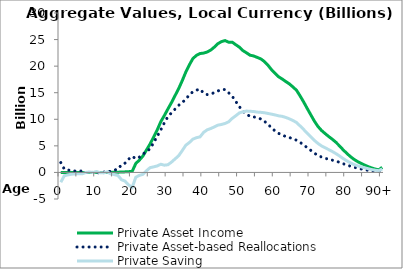
| Category | Private Asset Income | Private Asset-based Reallocations | Private Saving |
|---|---|---|---|
| 0 | 0 | 1848.723 | -1848.723 |
|  | 0 | 621.304 | -621.304 |
| 2 | 0 | 463.708 | -463.708 |
| 3 | 0 | 339.941 | -339.941 |
| 4 | 0 | 268.465 | -268.465 |
| 5 | 0 | 250.375 | -250.375 |
| 6 | 0.54 | 271.318 | -270.779 |
| 7 | 1.483 | 6.228 | -4.745 |
| 8 | 2.425 | -84.555 | 86.979 |
| 9 | 3.034 | 21.461 | -18.427 |
| 10 | 3.528 | -180.716 | 184.243 |
| 11 | 4.622 | 66.007 | -61.385 |
| 12 | 6.54 | 94.788 | -88.248 |
| 13 | 8.104 | -99.716 | 107.82 |
| 14 | 17.274 | 296.688 | -279.414 |
| 15 | 30.619 | 434.436 | -403.817 |
| 16 | 47.949 | 622.904 | -574.954 |
| 17 | 70.703 | 1446.324 | -1375.622 |
| 18 | 106.69 | 1750.698 | -1644.008 |
| 19 | 146.236 | 2509.724 | -2363.488 |
| 20 | 202.165 | 3020.792 | -2818.627 |
| 21 | 1678.616 | 2594.838 | -916.221 |
| 22 | 2319.44 | 2875.159 | -555.719 |
| 23 | 3084.248 | 3448.272 | -364.024 |
| 24 | 4225.514 | 3903.711 | 321.803 |
| 25 | 5349.457 | 4455.127 | 894.33 |
| 26 | 6650.23 | 5601.768 | 1048.463 |
| 27 | 8001.306 | 6782.23 | 1219.076 |
| 28 | 9540.818 | 8003.009 | 1537.809 |
| 29 | 10709.591 | 9346.703 | 1362.888 |
| 30 | 11948.887 | 10504.693 | 1444.194 |
| 31 | 13151.682 | 11209.677 | 1942.005 |
| 32 | 14460.383 | 11919.344 | 2541.039 |
| 33 | 15764.883 | 12625.617 | 3139.266 |
| 34 | 17255.071 | 13160.661 | 4094.409 |
| 35 | 18879.173 | 13761.107 | 5118.065 |
| 36 | 20244.569 | 14615.818 | 5628.751 |
| 37 | 21442.776 | 15179.611 | 6263.164 |
| 38 | 22026.912 | 15488.7 | 6538.213 |
| 39 | 22372.814 | 15678.939 | 6693.876 |
| 40 | 22455.101 | 14912.871 | 7542.23 |
| 41 | 22666.132 | 14650.283 | 8015.849 |
| 42 | 23031.389 | 14767.59 | 8263.8 |
| 43 | 23582.456 | 15016.067 | 8566.389 |
| 44 | 24229.234 | 15333.427 | 8895.807 |
| 45 | 24619.942 | 15594.78 | 9025.162 |
| 46 | 24807.381 | 15592.095 | 9215.286 |
| 47 | 24511.993 | 14988.483 | 9523.51 |
| 48 | 24517.798 | 14348.171 | 10169.627 |
| 49 | 24026.574 | 13357.756 | 10668.818 |
| 50 | 23571.824 | 12377.338 | 11194.487 |
| 51 | 22927.644 | 11518.749 | 11408.895 |
| 52 | 22506.66 | 10960.152 | 11546.509 |
| 53 | 22058.193 | 10551.559 | 11506.634 |
| 54 | 21915.818 | 10453.219 | 11462.599 |
| 55 | 21645.099 | 10291.448 | 11353.651 |
| 56 | 21366.426 | 10061.133 | 11305.293 |
| 57 | 20875.816 | 9641.771 | 11234.045 |
| 58 | 20181.87 | 9086.375 | 11095.495 |
| 59 | 19338.082 | 8372.546 | 10965.536 |
| 60 | 18633.516 | 7816.136 | 10817.38 |
| 61 | 17999.416 | 7349.475 | 10649.94 |
| 62 | 17574.958 | 7023.476 | 10551.483 |
| 63 | 17104.173 | 6758.134 | 10346.039 |
| 64 | 16658.611 | 6574.951 | 10083.661 |
| 65 | 16082.324 | 6313.743 | 9768.581 |
| 66 | 15465.278 | 6065.005 | 9400.273 |
| 67 | 14405.564 | 5655.47 | 8750.095 |
| 68 | 13258.741 | 5180.744 | 8077.997 |
| 69 | 12038.357 | 4651.632 | 7386.725 |
| 70 | 10843.658 | 4152.213 | 6691.445 |
| 71 | 9663.127 | 3631.863 | 6031.264 |
| 72 | 8658.305 | 3201.953 | 5456.352 |
| 73 | 7897.835 | 2901.827 | 4996.008 |
| 74 | 7320.664 | 2678.478 | 4642.186 |
| 75 | 6766.877 | 2465.558 | 4301.318 |
| 76 | 6260.119 | 2314.776 | 3945.343 |
| 77 | 5697.887 | 2142.151 | 3555.736 |
| 78 | 5022.788 | 1907.382 | 3115.406 |
| 79 | 4296.203 | 1656.532 | 2639.671 |
| 80 | 3639.62 | 1426.918 | 2212.702 |
| 81 | 3036.439 | 1195.169 | 1841.27 |
| 82 | 2509.393 | 987.938 | 1521.456 |
| 83 | 2083.217 | 817.432 | 1265.785 |
| 84 | 1737.673 | 666.572 | 1071.102 |
| 85 | 1411.729 | 525.213 | 886.515 |
| 86 | 1108.573 | 401.864 | 706.709 |
| 87 | 850.307 | 300.1 | 550.207 |
| 88 | 640.855 | 218.709 | 422.146 |
| 89 | 473.023 | 158.917 | 314.107 |
| 90+ | 960.054 | 317.496 | 642.558 |